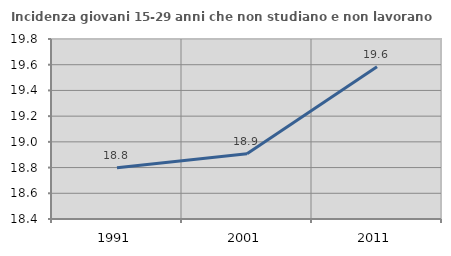
| Category | Incidenza giovani 15-29 anni che non studiano e non lavorano  |
|---|---|
| 1991.0 | 18.799 |
| 2001.0 | 18.908 |
| 2011.0 | 19.583 |